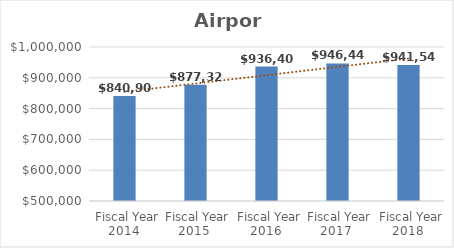
| Category | Airport |
|---|---|
| Fiscal Year 2014 | 840903 |
| Fiscal Year 2015 | 877320 |
| Fiscal Year 2016 | 936408 |
| Fiscal Year 2017 | 946440 |
| Fiscal Year 2018 | 941546 |